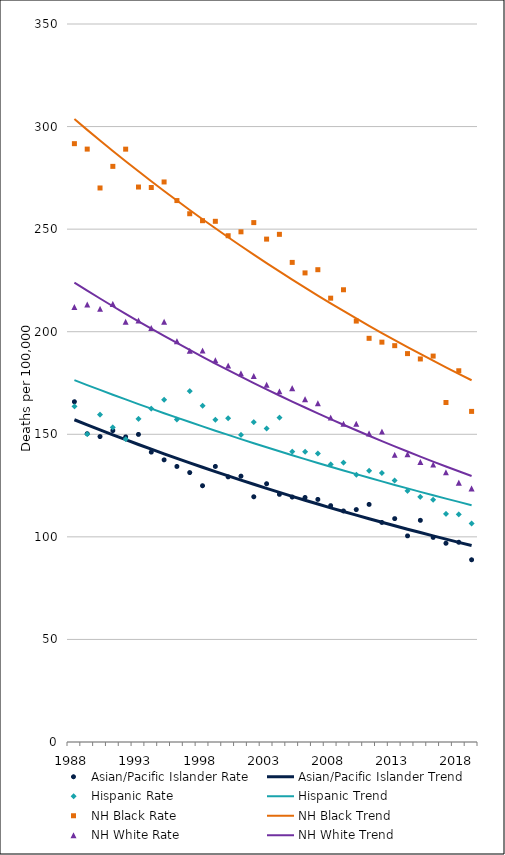
| Category | Asian/Pacific Islander Rate | Asian/Pacific Islander Trend | Hispanic Rate | Hispanic Trend | NH Black Rate | NH Black Trend | NH White Rate | NH White Trend |
|---|---|---|---|---|---|---|---|---|
| 1988.0 | 165.87 | 157.08 | 163.62 | 176.37 | 291.67 | 303.67 | 212.03 | 223.96 |
| 1989.0 | 150.27 | 154.59 | 150.06 | 173.98 | 289.02 | 298.39 | 213.29 | 220.05 |
| 1990.0 | 148.89 | 152.15 | 159.58 | 171.62 | 270.07 | 293.21 | 211.16 | 216.2 |
| 1991.0 | 151.8 | 149.74 | 153.38 | 169.29 | 280.6 | 288.11 | 213.56 | 212.42 |
| 1992.0 | 148.72 | 147.37 | 147.64 | 166.99 | 288.99 | 283.11 | 204.87 | 208.71 |
| 1993.0 | 149.94 | 145.03 | 157.54 | 164.72 | 270.53 | 278.19 | 205.49 | 205.06 |
| 1994.0 | 141.31 | 142.74 | 162.47 | 162.49 | 270.29 | 273.35 | 201.8 | 201.48 |
| 1995.0 | 137.53 | 140.48 | 166.79 | 160.28 | 273 | 268.6 | 204.83 | 197.96 |
| 1996.0 | 134.32 | 138.25 | 157.17 | 158.1 | 263.93 | 263.93 | 195.41 | 194.5 |
| 1997.0 | 131.34 | 136.06 | 171.03 | 155.96 | 257.51 | 259.35 | 190.73 | 191.1 |
| 1998.0 | 124.93 | 133.91 | 163.9 | 153.84 | 254.12 | 254.84 | 190.81 | 187.76 |
| 1999.0 | 134.32 | 131.79 | 157.12 | 151.75 | 253.82 | 250.41 | 186.07 | 184.48 |
| 2000.0 | 129.24 | 129.7 | 157.84 | 149.69 | 246.79 | 246.06 | 183.48 | 181.25 |
| 2001.0 | 129.58 | 127.65 | 149.67 | 147.66 | 248.7 | 241.78 | 179.72 | 178.09 |
| 2002.0 | 119.54 | 125.63 | 155.92 | 145.65 | 253.19 | 237.58 | 178.42 | 174.97 |
| 2003.0 | 125.88 | 123.64 | 152.79 | 143.68 | 245.14 | 233.45 | 174.17 | 171.92 |
| 2004.0 | 120.72 | 121.68 | 158.13 | 141.73 | 247.47 | 229.39 | 170.92 | 168.91 |
| 2005.0 | 119.41 | 119.75 | 141.56 | 139.8 | 233.79 | 225.41 | 172.48 | 165.96 |
| 2006.0 | 119.19 | 117.86 | 141.48 | 137.9 | 228.67 | 221.49 | 167.12 | 163.06 |
| 2007.0 | 118.26 | 115.99 | 140.63 | 136.03 | 230.23 | 217.64 | 165.11 | 160.21 |
| 2008.0 | 115.2 | 114.15 | 135.34 | 134.19 | 216.35 | 213.86 | 158.15 | 157.41 |
| 2009.0 | 112.63 | 112.35 | 136.23 | 132.36 | 220.45 | 210.14 | 155.12 | 154.66 |
| 2010.0 | 113.3 | 110.57 | 130.29 | 130.57 | 205.19 | 206.49 | 155.13 | 151.96 |
| 2011.0 | 115.82 | 108.82 | 132.25 | 128.79 | 196.78 | 202.9 | 150.44 | 149.3 |
| 2012.0 | 107.03 | 107.09 | 131.13 | 127.05 | 194.91 | 199.37 | 151.32 | 146.69 |
| 2013.0 | 108.89 | 105.4 | 127.46 | 125.32 | 193.2 | 195.91 | 139.98 | 144.13 |
| 2014.0 | 100.48 | 103.73 | 122.44 | 123.62 | 189.33 | 192.5 | 140.29 | 141.61 |
| 2015.0 | 108.06 | 102.09 | 119.5 | 121.94 | 186.72 | 189.16 | 136.51 | 139.13 |
| 2016.0 | 99.73 | 100.47 | 118.1 | 120.29 | 188.12 | 185.87 | 135.24 | 136.7 |
| 2017.0 | 96.88 | 98.88 | 111.19 | 118.65 | 165.5 | 182.64 | 131.44 | 134.31 |
| 2018.0 | 97.37 | 97.31 | 110.93 | 117.04 | 180.96 | 179.47 | 126.42 | 131.97 |
| 2019.0 | 88.83 | 95.77 | 106.52 | 115.45 | 161.16 | 176.35 | 123.63 | 129.66 |